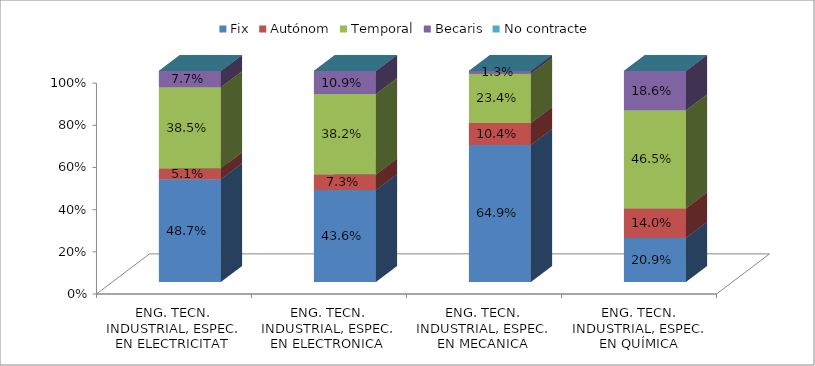
| Category | Fix | Autónom | Temporal | Becaris | No contracte |
|---|---|---|---|---|---|
| ENG. TECN. INDUSTRIAL, ESPEC. EN ELECTRICITAT | 0.487 | 0.051 | 0.385 | 0.077 | 0 |
| ENG. TECN. INDUSTRIAL, ESPEC. EN ELECTRONICA INDUSTRIAL | 0.436 | 0.073 | 0.382 | 0.109 | 0 |
| ENG. TECN. INDUSTRIAL, ESPEC. EN MECANICA | 0.649 | 0.104 | 0.234 | 0.013 | 0 |
| ENG. TECN. INDUSTRIAL, ESPEC. EN QUÍMICA INDUSTRIAL | 0.209 | 0.14 | 0.465 | 0.186 | 0 |